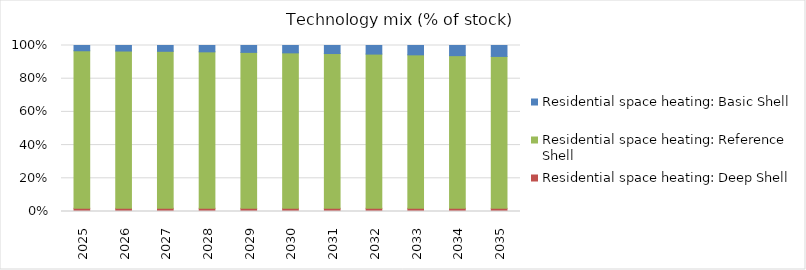
| Category | Residential space heating: Deep Shell | Residential space heating: Reference Shell | Residential space heating: Basic Shell |
|---|---|---|---|
| 2025.0 | 0.019 | 0.949 | 0.032 |
| 2026.0 | 0.019 | 0.948 | 0.033 |
| 2027.0 | 0.019 | 0.946 | 0.035 |
| 2028.0 | 0.019 | 0.943 | 0.038 |
| 2029.0 | 0.019 | 0.939 | 0.041 |
| 2030.0 | 0.019 | 0.936 | 0.044 |
| 2031.0 | 0.019 | 0.932 | 0.048 |
| 2032.0 | 0.019 | 0.929 | 0.052 |
| 2033.0 | 0.019 | 0.925 | 0.056 |
| 2034.0 | 0.019 | 0.92 | 0.061 |
| 2035.0 | 0.019 | 0.915 | 0.066 |